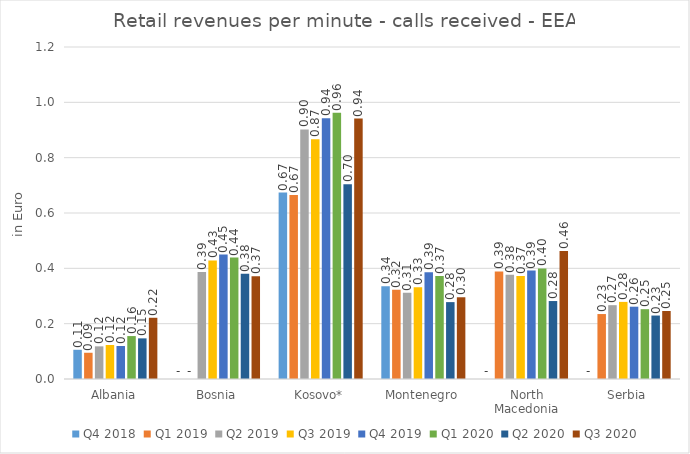
| Category | Q4 2018 | Q1 2019 | Q2 2019 | Q3 2019 | Q4 2019 | Q1 2020 | Q2 2020 | Q3 2020 |
|---|---|---|---|---|---|---|---|---|
| Albania | 0.106 | 0.095 | 0.118 | 0.123 | 0.119 | 0.155 | 0.147 | 0.221 |
| Bosnia | 0 | 0 | 0.387 | 0.428 | 0.45 | 0.439 | 0.38 | 0.371 |
| Kosovo* | 0.674 | 0.665 | 0.902 | 0.866 | 0.942 | 0.962 | 0.704 | 0.941 |
| Montenegro | 0.335 | 0.323 | 0.311 | 0.331 | 0.386 | 0.373 | 0.278 | 0.295 |
| North Macedonia | 0 | 0.389 | 0.377 | 0.372 | 0.392 | 0.399 | 0.282 | 0.463 |
| Serbia | 0 | 0.235 | 0.267 | 0.279 | 0.261 | 0.252 | 0.229 | 0.246 |